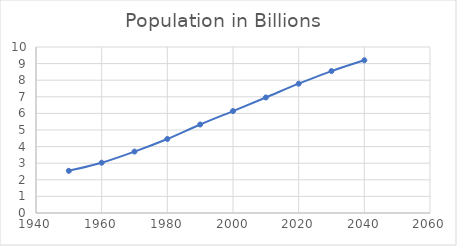
| Category | Population in Billions  |
|---|---|
| 1950.0 | 2.54 |
| 1960.0 | 3.03 |
| 1970.0 | 3.7 |
| 1980.0 | 4.46 |
| 1990.0 | 5.33 |
| 2000.0 | 6.14 |
| 2010.0 | 6.96 |
| 2020.0 | 7.79 |
| 2030.0 | 8.55 |
| 2040.0 | 9.2 |